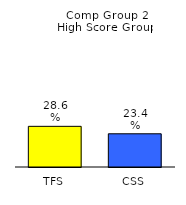
| Category | Series 0 |
|---|---|
| TFS | 0.286 |
| CSS | 0.234 |